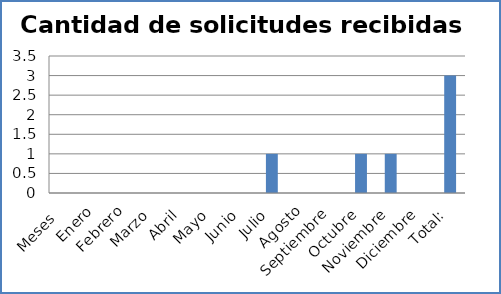
| Category | Series 0 | Series 1 | Series 2 |
|---|---|---|---|
| Meses  | 0 |  |  |
| Enero | 0 |  |  |
| Febrero | 0 |  |  |
| Marzo | 0 |  |  |
| Abril | 0 |  |  |
| Mayo | 0 |  |  |
| Junio | 0 |  |  |
| Julio | 1 |  |  |
| Agosto | 0 |  |  |
| Septiembre | 0 |  |  |
| Octubre | 1 |  |  |
| Noviembre | 1 |  |  |
| Diciembre | 0 |  |  |
| Total:  | 3 |  |  |